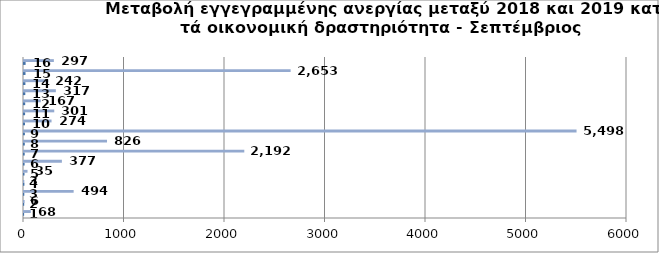
| Category | Series 0 | Series 1 |
|---|---|---|
| 0 | 1 | 68 |
| 1 | 2 | 6 |
| 2 | 3 | 494 |
| 3 | 4 | 3 |
| 4 | 5 | 35 |
| 5 | 6 | 377 |
| 6 | 7 | 2192 |
| 7 | 8 | 826 |
| 8 | 9 | 5498 |
| 9 | 10 | 274 |
| 10 | 11 | 301 |
| 11 | 12 | 167 |
| 12 | 13 | 317 |
| 13 | 14 | 242 |
| 14 | 15 | 2653 |
| 15 | 16 | 297 |